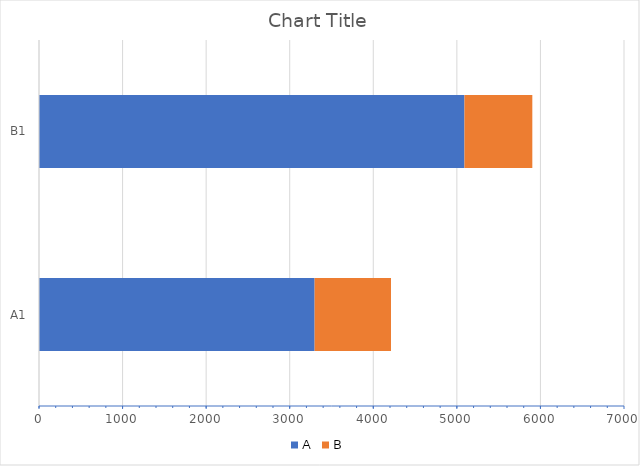
| Category | A | B |
|---|---|---|
| A1 | 3298 | 914 |
| B1 | 5091 | 812 |